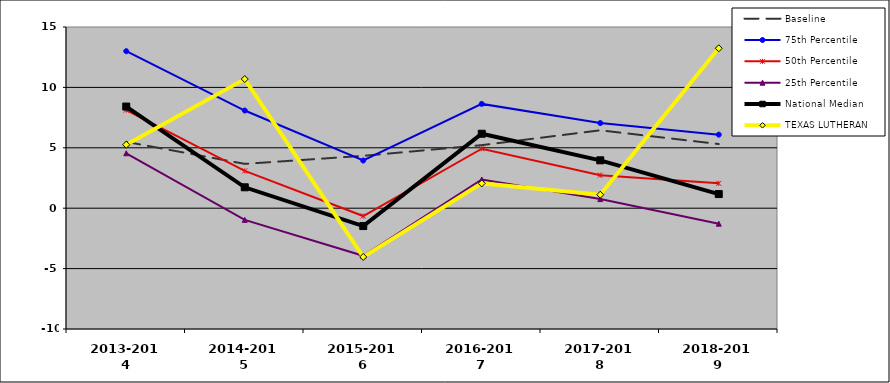
| Category | Baseline | 75th Percentile | 50th Percentile | 25th Percentile | National Median | TEXAS LUTHERAN |
|---|---|---|---|---|---|---|
| 2013-2014 | 5.492 | 12.997 | 8.123 | 4.547 | 8.415 | 5.258 |
| 2014-2015 | 3.67 | 8.086 | 3.088 | -0.966 | 1.73 | 10.692 |
| 2015-2016 | 4.335 | 3.947 | -0.651 | -3.94 | -1.479 | -4.036 |
| 2016-2017 | 5.22 | 8.634 | 4.925 | 2.377 | 6.164 | 2.053 |
| 2017-2018 | 6.45 | 7.047 | 2.732 | 0.755 | 3.963 | 1.117 |
| 2018-2019 | 5.311 | 6.089 | 2.057 | -1.281 | 1.169 | 13.237 |